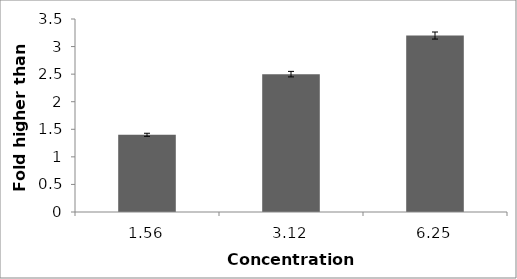
| Category | Series 0 |
|---|---|
| 1.56 | 1.4 |
| 3.12 | 2.5 |
| 6.25 | 3.2 |